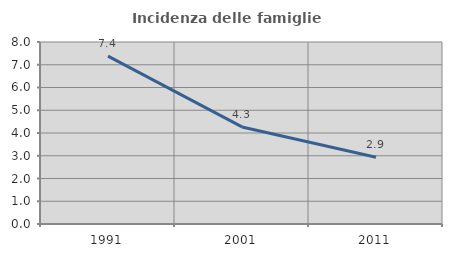
| Category | Incidenza delle famiglie numerose |
|---|---|
| 1991.0 | 7.38 |
| 2001.0 | 4.267 |
| 2011.0 | 2.935 |